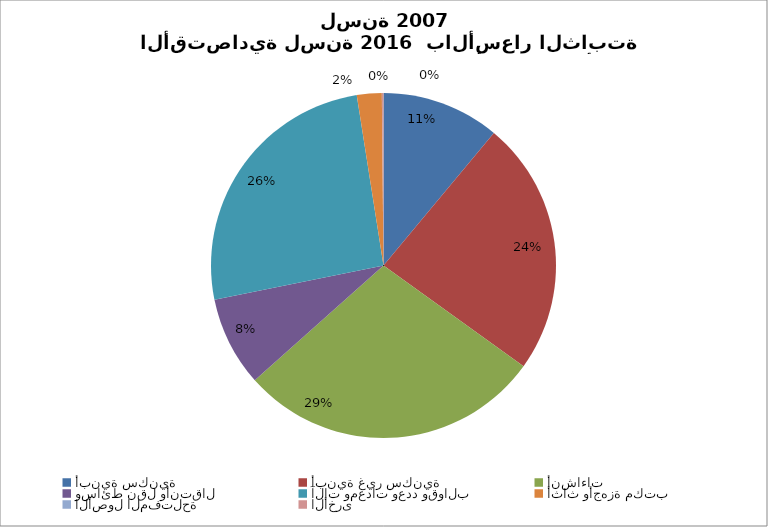
| Category | Series 0 |
|---|---|
| أبنية سكنية | 25251.417 |
| أبنية غير سكنية | 54545.895 |
| أنشاءات | 65071.936 |
| وسائط نقل وأنتقال | 19199.939 |
| آلات ومعدات وعدد وقوالب | 58736.913 |
| أثاث وأجهزة مكتب | 5318.87 |
| الأصول المفتلحة | 26.61 |
| الأخرى  | 324.642 |